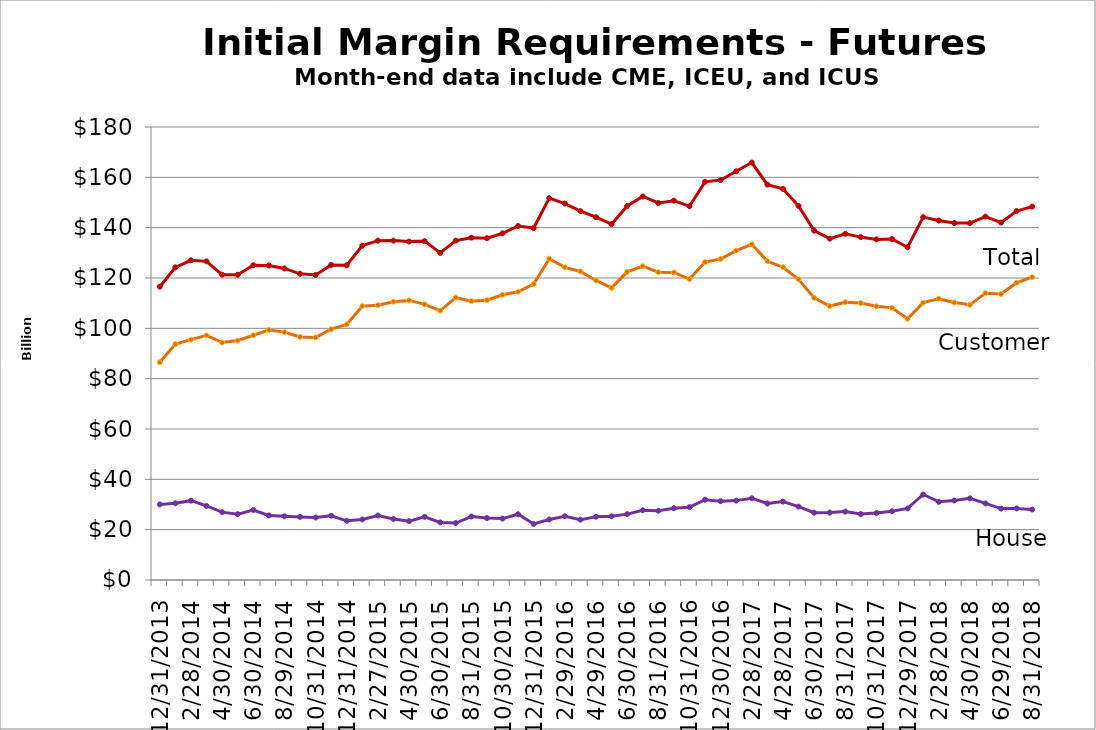
| Category | Customer | House | Total |
|---|---|---|---|
| 2013-12-31 |  |  |  |
| nan |  |  |  |
| 2014-02-28 |  |  |  |
| nan |  |  |  |
| 2014-04-30 |  |  |  |
| nan |  |  |  |
| 2014-06-30 |  |  |  |
| nan |  |  |  |
| 2014-08-29 |  |  |  |
| nan |  |  |  |
| 2014-10-31 |  |  |  |
| nan |  |  |  |
| 2014-12-31 |  |  |  |
| nan |  |  |  |
| 2015-02-27 |  |  |  |
| nan |  |  |  |
| 2015-04-30 |  |  |  |
| nan |  |  |  |
| 2015-06-30 |  |  |  |
| nan |  |  |  |
| 2015-08-31 |  |  |  |
| nan |  |  |  |
| 2015-10-30 |  |  |  |
| nan |  |  |  |
| 2015-12-31 |  |  |  |
| nan |  |  |  |
| 2016-02-29 |  |  |  |
| nan |  |  |  |
| 2016-04-29 |  |  |  |
| nan |  |  |  |
| 2016-06-30 |  |  |  |
| nan |  |  |  |
| 2016-08-31 |  |  |  |
| nan |  |  |  |
| 2016-10-31 |  |  |  |
| nan |  |  |  |
| 2016-12-30 |  |  |  |
| nan |  |  |  |
| 2017-02-28 |  |  |  |
| nan |  |  |  |
| 2017-04-28 |  |  |  |
| nan |  |  |  |
| 2017-06-30 |  |  |  |
| nan |  |  |  |
| 2017-08-31 |  |  |  |
| nan |  |  |  |
| 2017-10-31 |  |  |  |
| nan |  |  |  |
| 2017-12-29 |  |  |  |
| nan |  |  |  |
| 2018-02-28 |  |  |  |
| nan |  |  |  |
| 2018-04-30 |  |  |  |
| nan |  |  |  |
| 2018-06-29 |  |  |  |
| nan |  |  |  |
| 2018-08-31 |  |  |  |